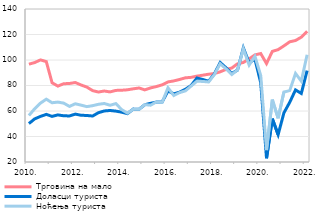
| Category | Трговина на мало | Доласци туриста | Ноћења туриста  |
|---|---|---|---|
| 2010. | 96.722 | 50.141 | 56.486 |
| II | 97.998 | 53.823 | 61.752 |
| III | 100.074 | 55.772 | 66.19 |
| IV | 98.748 | 57.333 | 69.262 |
| 2011. | 82.137 | 55.783 | 66.471 |
| II | 79.522 | 56.955 | 66.984 |
| III | 81.383 | 56.229 | 66.2 |
| IV | 81.584 | 56.138 | 63.598 |
| 2012. | 82.344 | 57.543 | 65.665 |
| II | 80.405 | 56.677 | 64.601 |
| III | 78.742 | 56.472 | 63.428 |
| IV | 75.967 | 56.08 | 64.195 |
| 2013. | 74.883 | 58.685 | 65.258 |
| II | 75.678 | 60.018 | 65.889 |
| III | 74.975 | 60.399 | 64.515 |
| IV | 76.153 | 59.906 | 65.798 |
| 2014. | 76.286 | 59.103 | 61.115 |
| II | 76.628 | 57.957 | 58.337 |
| III | 77.399 | 61.483 | 61.322 |
| IV | 78.038 | 61.37 | 61.286 |
| 2015. | 76.572 | 64.939 | 65.022 |
| II | 78.122 | 66.035 | 64.574 |
| III | 79.165 | 67.006 | 67.127 |
| IV | 80.55 | 67.142 | 66.88 |
| 2016. | 82.814 | 75.712 | 78.153 |
| II | 83.601 | 73.464 | 72.163 |
| III | 84.718 | 74.774 | 74.447 |
| IV | 86.021 | 77.041 | 75.787 |
| 2017. | 86.402 | 80.077 | 79.629 |
| II | 87.354 | 85.878 | 83.399 |
| III | 88.076 | 84.703 | 83.181 |
| IV | 88.833 | 83.371 | 82.763 |
| 2018. | 89.388 | 89.073 | 88.614 |
| II | 90.713 | 98.055 | 97.064 |
| III | 92.614 | 93.946 | 93.077 |
| IV | 93.685 | 89.462 | 88.59 |
| 2019. | 97.056 | 92.075 | 92.213 |
| II | 98.068 | 109.514 | 108.823 |
| III | 100.856 | 97.769 | 96.058 |
| IV | 104.02 | 100.642 | 102.906 |
| 2020. | 105.052 | 82.139 | 87.813 |
| II | 97.2 | 22.876 | 29.346 |
| III | 106.759 | 53.943 | 68.934 |
| IV | 108.124 | 41.445 | 54.297 |
| 2021. | 111.078 | 58.569 | 74.876 |
| II | 114.271 | 66.786 | 75.992 |
| III | 115.283 | 76.527 | 89.478 |
| IV | 117.911 | 73.774 | 83.402 |
| 2022. | 122.475 | 91.693 | 104.126 |